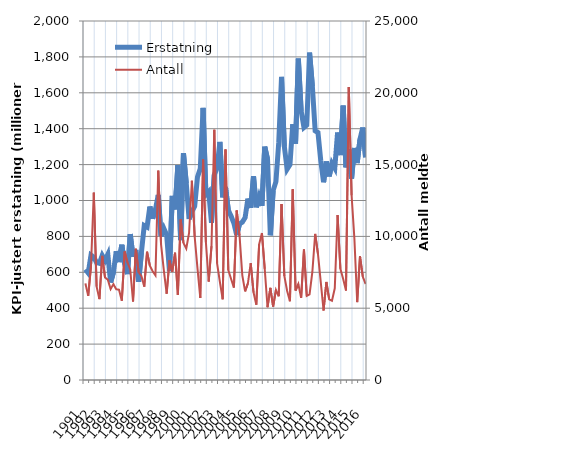
| Category | Erstatning |
|---|---|
| 1991.0 | 616.265 |
| nan | 596.168 |
| nan | 695.61 |
| nan | 683.787 |
| 1992.0 | 654.264 |
| nan | 650.086 |
| nan | 694.114 |
| nan | 666.281 |
| 1993.0 | 699.623 |
| nan | 543.342 |
| nan | 599.474 |
| nan | 717.435 |
| 1994.0 | 656.906 |
| nan | 753.578 |
| nan | 645.873 |
| nan | 589.696 |
| 1995.0 | 812.756 |
| nan | 686.966 |
| nan | 724.85 |
| nan | 546.639 |
| 1996.0 | 712.208 |
| nan | 860.409 |
| nan | 851.828 |
| nan | 966.551 |
| 1997.0 | 899.002 |
| nan | 950.697 |
| nan | 1030.685 |
| nan | 801.293 |
| 1998.0 | 844.15 |
| nan | 808.933 |
| nan | 606.267 |
| nan | 1025.385 |
| 1999.0 | 950.061 |
| nan | 1196.371 |
| nan | 779.416 |
| nan | 1263.603 |
| 2000.0 | 1095.813 |
| nan | 896.795 |
| nan | 937.576 |
| nan | 967.604 |
| 2001.0 | 1131.039 |
| nan | 1177.33 |
| nan | 1515.944 |
| nan | 1033.131 |
| 2002.0 | 1049.331 |
| nan | 875.783 |
| nan | 1142.763 |
| nan | 1182.003 |
| 2003.0 | 1326.27 |
| nan | 1018.063 |
| nan | 1074.673 |
| nan | 946.444 |
| 2004.0 | 912.797 |
| nan | 873.195 |
| nan | 807.5 |
| nan | 869.948 |
| 2005.0 | 879.375 |
| nan | 904.695 |
| nan | 1010.665 |
| nan | 959.076 |
| 2006.0 | 1135.665 |
| nan | 961.881 |
| nan | 1020.075 |
| nan | 970.376 |
| 2007.0 | 1299.486 |
| nan | 1231.02 |
| nan | 806.52 |
| nan | 1055.097 |
| 2008.0 | 1105.097 |
| nan | 1322.141 |
| nan | 1688.162 |
| nan | 1300.465 |
| 2009.0 | 1174.208 |
| nan | 1198.81 |
| nan | 1424.867 |
| nan | 1316.505 |
| 2010.0 | 1790.678 |
| nan | 1498.539 |
| nan | 1406.97 |
| nan | 1420.541 |
| 2011.0 | 1823.95 |
| nan | 1636.407 |
| nan | 1388.709 |
| nan | 1378.57 |
| 2012.0 | 1221.062 |
| nan | 1101.625 |
| nan | 1217.401 |
| nan | 1134.299 |
| 2013.0 | 1206.888 |
| nan | 1180.135 |
| nan | 1378.612 |
| nan | 1252.996 |
| 2014.0 | 1528.653 |
| nan | 1185.046 |
| nan | 1285.623 |
| nan | 1122.101 |
| 2015.0 | 1292.782 |
| nan | 1208.47 |
| nan | 1342.065 |
| nan | 1406.226 |
| 2016.0 | 1241.425 |